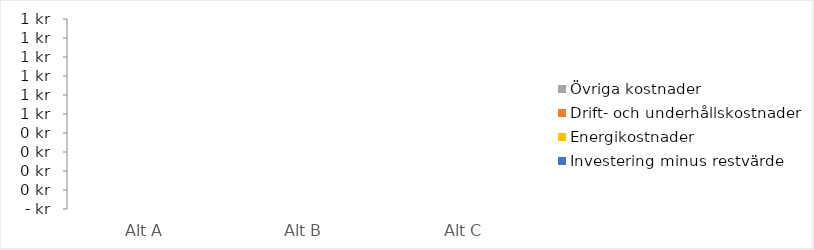
| Category | Investering minus restvärde | Energikostnader | Drift- och underhållskostnader | Övriga kostnader |
|---|---|---|---|---|
| Alt A | 0 | 0 | 0 | 0 |
| Alt B | 0 | 0 | 0 | 0 |
| Alt C | 0 | 0 | 0 | 0 |